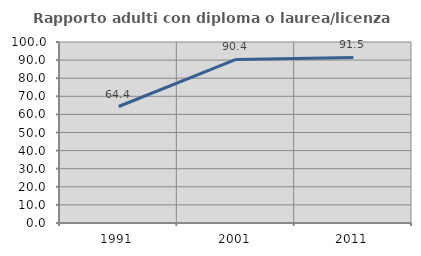
| Category | Rapporto adulti con diploma o laurea/licenza media  |
|---|---|
| 1991.0 | 64.356 |
| 2001.0 | 90.37 |
| 2011.0 | 91.503 |